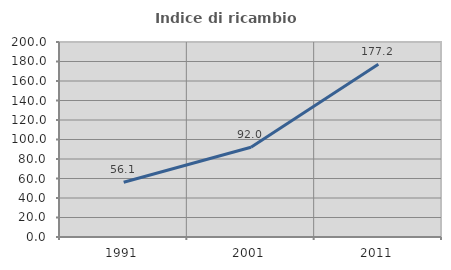
| Category | Indice di ricambio occupazionale  |
|---|---|
| 1991.0 | 56.098 |
| 2001.0 | 92 |
| 2011.0 | 177.222 |